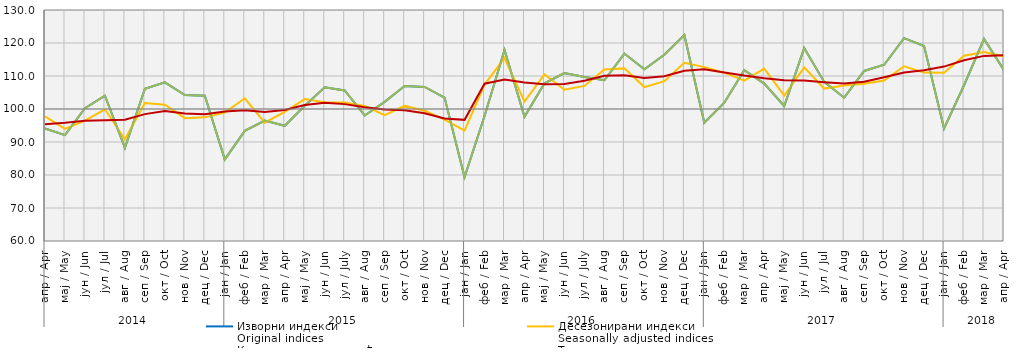
| Category | Изворни индекси
Original indices | Десезонирани индекси
Seasonally adjusted indices | Календарски прилагођени индекси
Working-day adjusted indices | Тренд
Trend |
|---|---|---|---|---|
| 0 | 94.098 | 97.756 | 94.098 | 95.379 |
| 1 | 92.073 | 93.984 | 92.073 | 95.828 |
| 2 | 100.223 | 96.46 | 100.223 | 96.44 |
| 3 | 104.036 | 99.914 | 104.036 | 96.579 |
| 4 | 88.225 | 90.839 | 88.225 | 96.762 |
| 5 | 106.132 | 101.824 | 106.132 | 98.446 |
| 6 | 108.074 | 101.278 | 108.074 | 99.381 |
| 7 | 104.242 | 97.222 | 104.242 | 98.667 |
| 8 | 104.032 | 97.463 | 104.032 | 98.411 |
| 9 | 84.716 | 98.887 | 84.716 | 99.256 |
| 10 | 93.365 | 103.256 | 93.365 | 99.648 |
| 11 | 96.491 | 95.868 | 96.491 | 99.127 |
| 12 | 94.914 | 99.131 | 94.914 | 99.702 |
| 13 | 101.001 | 102.998 | 101.001 | 101.197 |
| 14 | 106.571 | 102.048 | 106.571 | 101.864 |
| 15 | 105.634 | 101.986 | 105.634 | 101.477 |
| 16 | 98.032 | 100.925 | 98.032 | 100.54 |
| 17 | 102.175 | 98.121 | 102.175 | 99.843 |
| 18 | 106.973 | 100.931 | 106.973 | 99.61 |
| 19 | 106.679 | 99.464 | 106.679 | 98.704 |
| 20 | 103.448 | 96.762 | 103.448 | 97.122 |
| 21 | 79.358 | 93.443 | 79.358 | 96.713 |
| 22 | 97.898 | 107.396 | 97.898 | 107.675 |
| 23 | 117.913 | 115.46 | 117.913 | 108.915 |
| 24 | 97.629 | 102.24 | 97.629 | 108.048 |
| 25 | 107.793 | 110.504 | 107.793 | 107.487 |
| 26 | 110.869 | 105.826 | 110.869 | 107.579 |
| 27 | 109.684 | 107 | 109.684 | 108.548 |
| 28 | 108.719 | 111.974 | 108.719 | 110.087 |
| 29 | 116.799 | 112.307 | 116.799 | 110.222 |
| 30 | 112.011 | 106.639 | 112.011 | 109.376 |
| 31 | 116.451 | 108.422 | 116.451 | 109.948 |
| 32 | 122.432 | 114.019 | 122.432 | 111.586 |
| 33 | 95.812 | 112.687 | 95.812 | 112.022 |
| 34 | 101.907 | 111.002 | 101.907 | 111.09 |
| 35 | 111.746 | 108.569 | 111.746 | 110.13 |
| 36 | 107.7 | 112.216 | 107.7 | 109.328 |
| 37 | 100.901 | 104.052 | 100.901 | 108.695 |
| 38 | 118.466 | 112.605 | 118.466 | 108.631 |
| 39 | 108.212 | 106.184 | 108.212 | 108.126 |
| 40 | 103.433 | 107.115 | 103.433 | 107.693 |
| 41 | 111.521 | 107.683 | 111.521 | 108.257 |
| 42 | 113.414 | 108.622 | 113.414 | 109.633 |
| 43 | 121.479 | 112.953 | 121.479 | 111.045 |
| 44 | 119.1 | 111.034 | 119.1 | 111.755 |
| 45 | 94.101 | 110.975 | 94.101 | 112.848 |
| 46 | 107.2 | 116.166 | 107.218 | 114.764 |
| 47 | 121.246 | 117.244 | 121.246 | 116.094 |
| 48 | 111.733 | 115.964 | 111.733 | 116.26 |